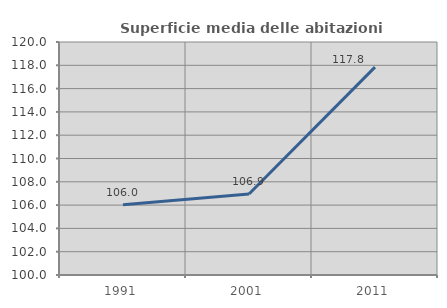
| Category | Superficie media delle abitazioni occupate |
|---|---|
| 1991.0 | 106.037 |
| 2001.0 | 106.948 |
| 2011.0 | 117.845 |